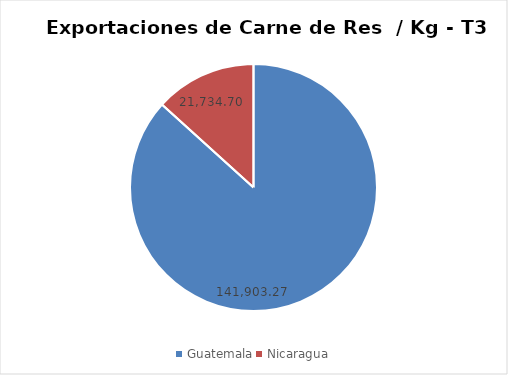
| Category | Series 0 |
|---|---|
| Guatemala | 141903.27 |
| Nicaragua | 21734.7 |